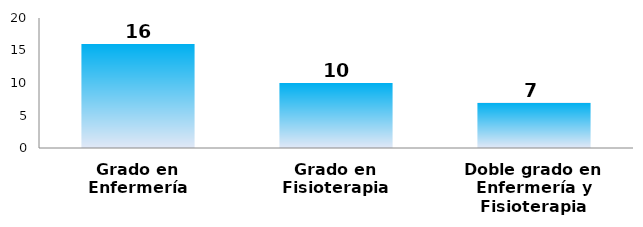
| Category | Series 0 |
|---|---|
| Grado en Enfermería | 16 |
| Grado en Fisioterapia | 10 |
| Doble grado en Enfermería y Fisioterapia | 7 |